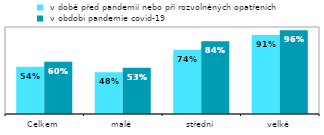
| Category |  v době před pandemií nebo při rozvolněných opatřeních |  v období pandemie covid-19 |
|---|---|---|
| Celkem | 0.542 | 0.601 |
| malé | 0.481 | 0.532 |
| střední | 0.739 | 0.835 |
| velké | 0.909 | 0.963 |